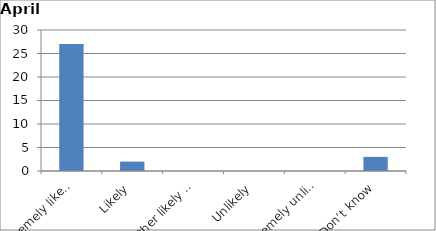
| Category | Series 0 |
|---|---|
| Extremely likely | 27 |
| Likely | 2 |
| Neither likely nor unlikely | 0 |
| Unlikely | 0 |
| Extremely unlikely | 0 |
| Don’t know | 3 |